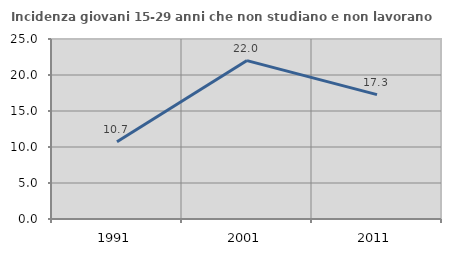
| Category | Incidenza giovani 15-29 anni che non studiano e non lavorano  |
|---|---|
| 1991.0 | 10.716 |
| 2001.0 | 22 |
| 2011.0 | 17.273 |